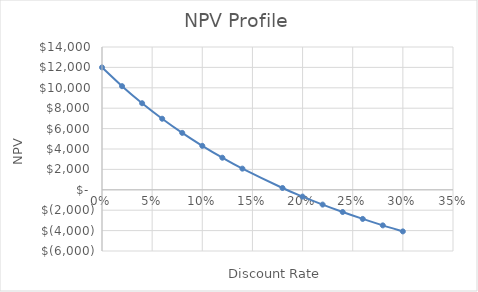
| Category | Series 0 |
|---|---|
| 0.0 | 12000 |
| 0.02 | 10158.01 |
| 0.04 | 8486.888 |
| 0.06 | 6966.354 |
| 0.08 | 5578.964 |
| 0.1 | 4309.665 |
| 0.12 | 3145.421 |
| 0.14 | 2074.905 |
| 0.18 | 176.814 |
| 0.2 | -666.956 |
| 0.22 | -1449.718 |
| 0.24 | -2177.337 |
| 0.26 | -2854.998 |
| 0.28 | -3487.298 |
| 0.3 | -4078.319 |